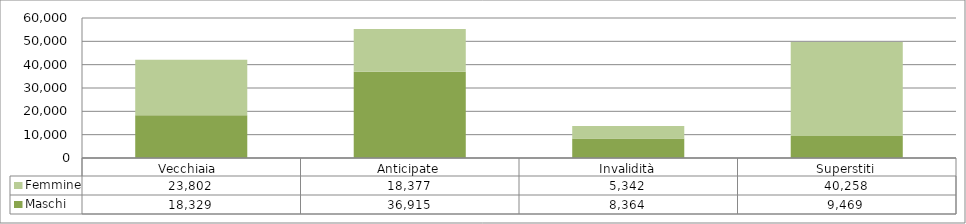
| Category | Maschi | Femmine |
|---|---|---|
| Vecchiaia  | 18329 | 23802 |
| Anticipate | 36915 | 18377 |
| Invalidità | 8364 | 5342 |
| Superstiti | 9469 | 40258 |